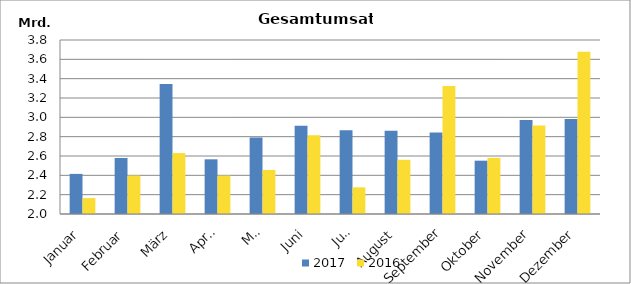
| Category | 2017 | 2016 |
|---|---|---|
| Januar | 2414821.172 | 2164436.822 |
| Februar | 2579117.41 | 2397689.483 |
| März | 3345538.791 | 2630053.793 |
| April | 2565703.706 | 2397213.296 |
| Mai | 2792329.406 | 2455510.83 |
| Juni | 2911668.472 | 2815097.283 |
| Juli | 2866678.848 | 2275597.163 |
| August | 2861084.874 | 2560776.552 |
| September | 2843158.647 | 3324592.305 |
| Oktober | 2551593.16 | 2580457.175 |
| November | 2973201.871 | 2916677.489 |
| Dezember | 2982047.659 | 3678442.036 |